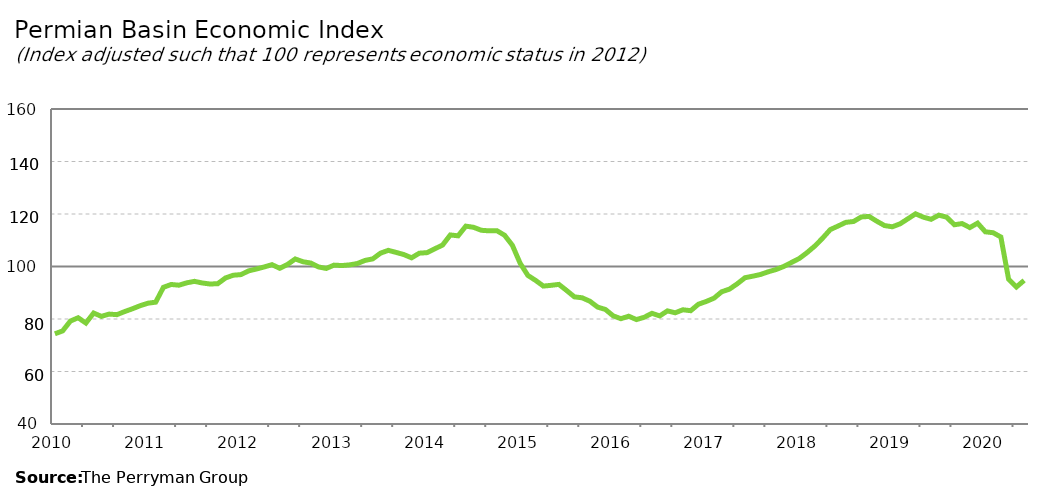
| Category | Permian Basin Composite |
|---|---|
| 2010-01-31 | 74.365 |
| 2010-02-28 | 75.464 |
| 2010-03-31 | 79.216 |
| 2010-04-30 | 80.476 |
| 2010-05-31 | 78.461 |
| 2010-06-30 | 82.272 |
| 2010-07-31 | 81.004 |
| 2010-08-31 | 81.87 |
| 2010-09-30 | 81.652 |
| 2010-10-31 | 82.831 |
| 2010-11-30 | 83.892 |
| 2010-12-31 | 85.064 |
| 2011-01-31 | 86.019 |
| 2011-02-28 | 86.407 |
| 2011-03-31 | 92.072 |
| 2011-04-30 | 93.153 |
| 2011-05-31 | 92.876 |
| 2011-06-30 | 93.768 |
| 2011-07-31 | 94.351 |
| 2011-08-31 | 93.723 |
| 2011-09-30 | 93.334 |
| 2011-10-31 | 93.437 |
| 2011-11-30 | 95.627 |
| 2011-12-31 | 96.673 |
| 2012-01-31 | 96.914 |
| 2012-02-29 | 98.348 |
| 2012-03-31 | 99.043 |
| 2012-04-30 | 99.835 |
| 2012-05-31 | 100.699 |
| 2012-06-30 | 99.323 |
| 2012-07-31 | 100.788 |
| 2012-08-31 | 102.865 |
| 2012-09-30 | 101.811 |
| 2012-10-31 | 101.321 |
| 2012-11-30 | 99.827 |
| 2012-12-31 | 99.259 |
| 2013-01-31 | 100.528 |
| 2013-02-28 | 100.36 |
| 2013-03-31 | 100.619 |
| 2013-04-30 | 101.131 |
| 2013-05-31 | 102.306 |
| 2013-06-30 | 102.909 |
| 2013-07-31 | 105.089 |
| 2013-08-31 | 106.152 |
| 2013-09-30 | 105.376 |
| 2013-10-31 | 104.554 |
| 2013-11-30 | 103.311 |
| 2013-12-31 | 105.071 |
| 2014-01-31 | 105.283 |
| 2014-02-28 | 106.748 |
| 2014-03-31 | 108.175 |
| 2014-04-30 | 112.012 |
| 2014-05-31 | 111.689 |
| 2014-06-30 | 115.377 |
| 2014-07-31 | 114.928 |
| 2014-08-31 | 113.798 |
| 2014-09-30 | 113.587 |
| 2014-10-31 | 113.649 |
| 2014-11-30 | 111.896 |
| 2014-12-31 | 108.088 |
| 2015-01-31 | 101.256 |
| 2015-02-28 | 96.601 |
| 2015-03-31 | 94.695 |
| 2015-04-30 | 92.54 |
| 2015-05-31 | 92.83 |
| 2015-06-30 | 93.182 |
| 2015-07-31 | 90.854 |
| 2015-08-31 | 88.433 |
| 2015-09-30 | 88.079 |
| 2015-10-31 | 86.76 |
| 2015-11-30 | 84.526 |
| 2015-12-31 | 83.638 |
| 2016-01-31 | 81.199 |
| 2016-02-29 | 80.116 |
| 2016-03-31 | 81.064 |
| 2016-04-30 | 79.787 |
| 2016-05-31 | 80.647 |
| 2016-06-30 | 82.165 |
| 2016-07-31 | 81.174 |
| 2016-08-31 | 83.091 |
| 2016-09-30 | 82.368 |
| 2016-10-31 | 83.517 |
| 2016-11-30 | 83.16 |
| 2016-12-31 | 85.636 |
| 2017-01-31 | 86.673 |
| 2017-02-28 | 87.928 |
| 2017-03-31 | 90.383 |
| 2017-04-30 | 91.378 |
| 2017-05-31 | 93.402 |
| 2017-06-30 | 95.721 |
| 2017-07-31 | 96.308 |
| 2017-08-31 | 96.959 |
| 2017-09-30 | 97.988 |
| 2017-10-31 | 98.841 |
| 2017-11-30 | 100.009 |
| 2017-12-31 | 101.533 |
| 2018-01-31 | 103.052 |
| 2018-02-28 | 105.269 |
| 2018-03-31 | 107.778 |
| 2018-04-30 | 110.765 |
| 2018-05-31 | 114.059 |
| 2018-06-30 | 115.408 |
| 2018-07-31 | 116.814 |
| 2018-08-31 | 117.143 |
| 2018-09-30 | 118.874 |
| 2018-10-31 | 119.078 |
| 2018-11-30 | 117.25 |
| 2018-12-31 | 115.594 |
| 2019-01-31 | 115.13 |
| 2019-02-28 | 116.251 |
| 2019-03-31 | 118.161 |
| 2019-04-30 | 120.068 |
| 2019-05-31 | 118.799 |
| 2019-06-30 | 117.98 |
| 2019-07-31 | 119.548 |
| 2019-08-31 | 118.813 |
| 2019-09-30 | 115.9 |
| 2019-10-31 | 116.349 |
| 2019-11-30 | 114.828 |
| 2019-12-31 | 116.516 |
| 2020-01-31 | 113.213 |
| 2020-02-29 | 112.87 |
| 2020-03-31 | 111.228 |
| 2020-04-30 | 95.142 |
| 2020-05-31 | 92.19 |
| 2020-06-30 | 94.705 |